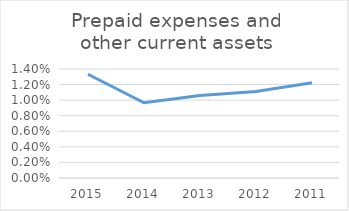
| Category | Prepaid expenses and other current assets |
|---|---|
| 2015.0 | 0.013 |
| 2014.0 | 0.01 |
| 2013.0 | 0.011 |
| 2012.0 | 0.011 |
| 2011.0 | 0.012 |